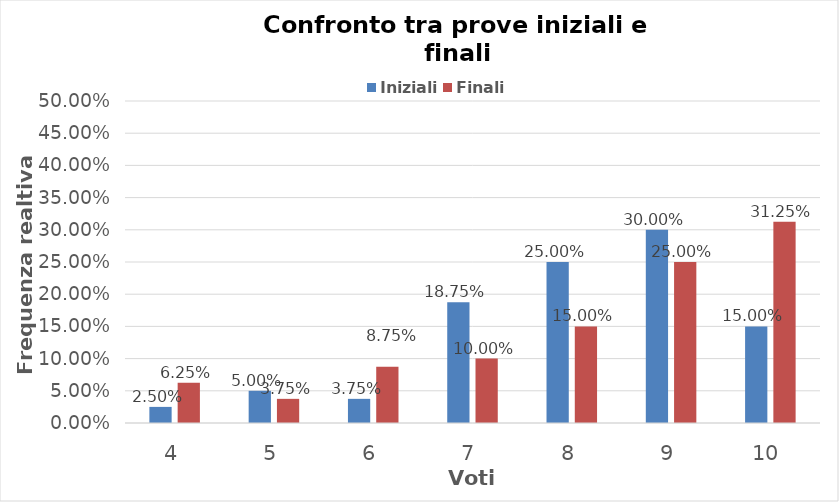
| Category | Iniziali | Finali |
|---|---|---|
| 4.0 | 0.025 | 0.062 |
| 5.0 | 0.05 | 0.038 |
| 6.0 | 0.038 | 0.088 |
| 7.0 | 0.188 | 0.1 |
| 8.0 | 0.25 | 0.15 |
| 9.0 | 0.3 | 0.25 |
| 10.0 | 0.15 | 0.312 |